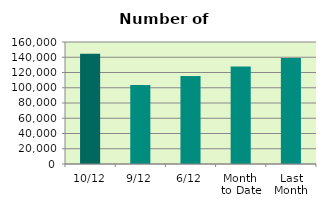
| Category | Series 0 |
|---|---|
| 10/12 | 144514 |
| 9/12 | 103654 |
| 6/12 | 115470 |
| Month 
to Date | 127900 |
| Last
Month | 138953.619 |